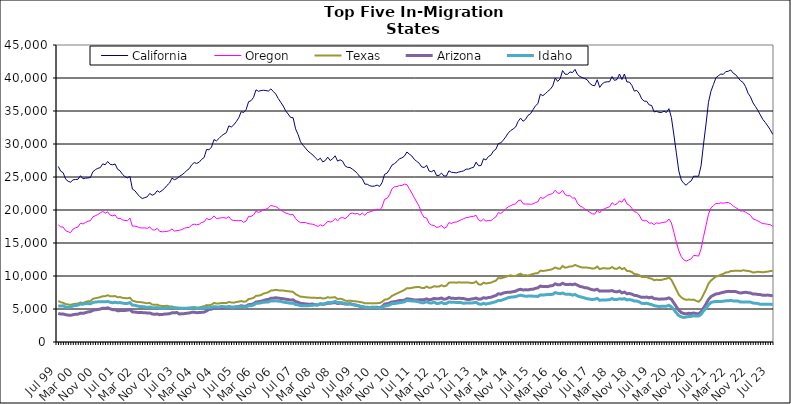
| Category |  California  |  Oregon  |  Texas  |  Arizona  |  Idaho  |
|---|---|---|---|---|---|
| Jul 99 | 26605 | 17749 | 6209 | 4339 | 5471 |
| Aug 99 | 25882 | 17447 | 6022 | 4228 | 5444 |
| Sep 99 | 25644 | 17401 | 5941 | 4237 | 5488 |
| Oct 99 | 24669 | 16875 | 5751 | 4134 | 5279 |
| Nov 99 | 24353 | 16701 | 5680 | 4073 | 5260 |
| Dec 99 | 24218 | 16570 | 5619 | 4042 | 5269 |
| Jan 00 | 24574 | 17109 | 5736 | 4142 | 5485 |
| Feb 00 | 24620 | 17295 | 5789 | 4192 | 5530 |
| Mar 00 | 24655 | 17436 | 5826 | 4226 | 5590 |
| Apr 00 | 25195 | 18009 | 5980 | 4375 | 5748 |
| May 00 | 24730 | 17875 | 5897 | 4337 | 5729 |
| Jun 00 | 24825 | 18113 | 6070 | 4444 | 5853 |
| Jul 00 | 24857 | 18294 | 6163 | 4555 | 5824 |
| Aug 00 | 24913 | 18376 | 6199 | 4603 | 5788 |
| Sep 00 | 25792 | 18971 | 6529 | 4804 | 5976 |
| Oct 00 | 26106 | 19135 | 6643 | 4870 | 6058 |
| Nov 00 | 26315 | 19306 | 6705 | 4926 | 6085 |
| Dec 00 | 26415 | 19570 | 6793 | 4991 | 6096 |
| Jan 01 | 26995 | 19781 | 6942 | 5122 | 6119 |
| Feb 01 | 26851 | 19519 | 6948 | 5089 | 6090 |
| Mar 01 | 27352 | 19720 | 7080 | 5180 | 6143 |
| Apr 01 | 26918 | 19221 | 6943 | 5020 | 6020 |
| May 01 | 26848 | 19126 | 6924 | 4899 | 5950 |
| Jun 01 | 26974 | 19241 | 6959 | 4895 | 6019 |
| Jul 01 | 26172 | 18725 | 6778 | 4737 | 5951 |
| Aug 01 | 25943 | 18736 | 6810 | 4757 | 5973 |
| Sep 01 | 25399 | 18514 | 6688 | 4753 | 5895 |
| Oct 01 | 25050 | 18415 | 6650 | 4780 | 5833 |
| Nov 01 | 24873 | 18381 | 6631 | 4826 | 5850 |
| Dec 01 | 25099 | 18765 | 6708 | 4898 | 5969 |
| Jan 02 | 23158 | 17561 | 6261 | 4560 | 5595 |
| Feb 02 | 22926 | 17573 | 6162 | 4531 | 5560 |
| Mar 02 | 22433 | 17452 | 6052 | 4481 | 5458 |
| Apr 02 | 22012 | 17314 | 6046 | 4458 | 5380 |
| May 02 | 21733 | 17267 | 6007 | 4452 | 5358 |
| Jun 02 | 21876 | 17298 | 5933 | 4444 | 5315 |
| Jul 02 | 21997 | 17209 | 5873 | 4383 | 5243 |
| Aug 02 | 22507 | 17436 | 5929 | 4407 | 5315 |
| Sep 02 | 22244 | 17010 | 5672 | 4248 | 5192 |
| Oct 02 | 22406 | 16952 | 5625 | 4191 | 5167 |
| Nov 02 | 22922 | 17223 | 5663 | 4242 | 5221 |
| Dec 02 | 22693 | 16770 | 5499 | 4142 | 5120 |
| Jan 03 | 22964 | 16694 | 5463 | 4166 | 5089 |
| Feb 03 | 23276 | 16727 | 5461 | 4226 | 5077 |
| Mar 03 | 23736 | 16766 | 5486 | 4251 | 5145 |
| Apr 03 | 24079 | 16859 | 5389 | 4289 | 5145 |
| May 03 | 24821 | 17117 | 5378 | 4415 | 5254 |
| Jun 03 | 24592 | 16812 | 5273 | 4426 | 5135 |
| Jul 03 | 24754 | 16875 | 5226 | 4466 | 5124 |
| Aug 03 | 25092 | 16922 | 5181 | 4244 | 5100 |
| Sep 03 | 25316 | 17036 | 5181 | 4279 | 5086 |
| Oct 03 | 25622 | 17228 | 5139 | 4301 | 5110 |
| Nov 03 | 25984 | 17335 | 5175 | 4362 | 5091 |
| Dec 03 | 26269 | 17350 | 5189 | 4396 | 5113 |
| Jan 04 | 26852 | 17734 | 5255 | 4492 | 5152 |
| Feb 04 | 27184 | 17860 | 5301 | 4502 | 5183 |
| Mar 04 | 27062 | 17757 | 5227 | 4443 | 5056 |
| Apr 04 | 27238 | 17840 | 5227 | 4461 | 5104 |
| May 04 | 27671 | 18113 | 5345 | 4493 | 5095 |
| Jun 04 | 27949 | 18201 | 5416 | 4532 | 5103 |
| Jul 04 | 29172 | 18727 | 5597 | 4697 | 5231 |
| Aug 04 | 29122 | 18529 | 5561 | 4945 | 5197 |
| Sep 04 | 29542 | 18678 | 5656 | 4976 | 5237 |
| Oct 04 | 30674 | 19108 | 5922 | 5188 | 5363 |
| Nov 04 | 30472 | 18716 | 5823 | 5106 | 5321 |
| Dec 04 | 30831 | 18755 | 5838 | 5135 | 5312 |
| Jan 05 | 31224 | 18823 | 5906 | 5155 | 5374 |
| Feb 05 | 31495 | 18842 | 5898 | 5168 | 5357 |
| Mar 05 | 31714 | 18738 | 5894 | 5212 | 5313 |
| Apr 05 | 32750 | 18998 | 6060 | 5340 | 5350 |
| May 05 | 32575 | 18504 | 5989 | 5269 | 5276 |
| Jun 05 | 32898 | 18414 | 5954 | 5252 | 5271 |
| Jul 05 | 33384 | 18395 | 6062 | 5322 | 5322 |
| Aug 05 | 33964 | 18381 | 6113 | 5375 | 5316 |
| Sep 05 | 34897 | 18426 | 6206 | 5493 | 5362 |
| Oct 05 | 34780 | 18132 | 6100 | 5408 | 5308 |
| Nov 05 | 35223 | 18332 | 6162 | 5434 | 5314 |
| Dec 05 | 36415 | 19047 | 6508 | 5658 | 5487 |
| Jan 06 | 36567 | 19032 | 6576 | 5688 | 5480 |
| Feb 06 | 37074 | 19257 | 6692 | 5792 | 5616 |
| Mar 06 | 38207 | 19845 | 6993 | 6052 | 5850 |
| Apr 06 | 37976 | 19637 | 7024 | 6101 | 5864 |
| May 06 | 38099 | 19781 | 7114 | 6178 | 5943 |
| Jun 06 | 38141 | 20061 | 7331 | 6276 | 6018 |
| Jul 06 | 38097 | 20111 | 7431 | 6399 | 6046 |
| Aug 06 | 38021 | 20333 | 7542 | 6450 | 6064 |
| Sep 06 | 38349 | 20686 | 7798 | 6627 | 6232 |
| Oct 06 | 37947 | 20591 | 7825 | 6647 | 6216 |
| Nov 06 | 37565 | 20526 | 7907 | 6707 | 6244 |
| Dec 06 | 36884 | 20272 | 7840 | 6648 | 6192 |
| Jan 07 | 36321 | 19984 | 7789 | 6597 | 6151 |
| Feb 07 | 35752 | 19752 | 7799 | 6554 | 6048 |
| Mar 07 | 35025 | 19547 | 7737 | 6487 | 5989 |
| Apr 07 | 34534 | 19412 | 7685 | 6430 | 5937 |
| May 07 | 34022 | 19296 | 7654 | 6353 | 5858 |
| Jun 07 | 33974 | 19318 | 7577 | 6390 | 5886 |
| Jul 07 | 32298 | 18677 | 7250 | 6117 | 5682 |
| Aug 07 | 31436 | 18322 | 7070 | 6034 | 5617 |
| Sep 07 | 30331 | 18087 | 6853 | 5847 | 5500 |
| Oct 07 | 29813 | 18108 | 6839 | 5821 | 5489 |
| Nov 07 | 29384 | 18105 | 6777 | 5769 | 5481 |
| Dec 07 | 28923 | 17949 | 6760 | 5733 | 5499 |
| Jan 08 | 28627 | 17890 | 6721 | 5732 | 5521 |
| Feb 08 | 28328 | 17834 | 6719 | 5749 | 5579 |
| Mar 08 | 27911 | 17680 | 6690 | 5650 | 5614 |
| Apr 08 | 27543 | 17512 | 6656 | 5612 | 5635 |
| May 08 | 27856 | 17754 | 6705 | 5774 | 5798 |
| Jun 08 | 27287 | 17589 | 6593 | 5717 | 5745 |
| Jul 08 | 27495 | 17834 | 6623 | 5761 | 5807 |
| Aug 08 | 28018 | 18309 | 6789 | 5867 | 5982 |
| Sep-08 | 27491 | 18164 | 6708 | 5864 | 5954 |
| Oct 08 | 27771 | 18291 | 6755 | 5942 | 6032 |
| Nov 08 | 28206 | 18706 | 6787 | 5970 | 6150 |
| Dec 08 | 27408 | 18353 | 6505 | 5832 | 5975 |
| Jan 09 | 27601 | 18778 | 6569 | 5890 | 5995 |
| Feb 09 | 27394 | 18863 | 6483 | 5845 | 5936 |
| Mar 09 | 26690 | 18694 | 6273 | 5751 | 5806 |
| Apr 09 | 26461 | 18943 | 6222 | 5735 | 5777 |
| May 09 | 26435 | 19470 | 6272 | 5819 | 5767 |
| Jun 09 | 26187 | 19522 | 6199 | 5700 | 5649 |
| Jul 09 | 25906 | 19408 | 6171 | 5603 | 5617 |
| Aug 09 | 25525 | 19469 | 6128 | 5533 | 5540 |
| Sep 09 | 25050 | 19249 | 6059 | 5405 | 5437 |
| Oct 09 | 24741 | 19529 | 6004 | 5349 | 5369 |
| Nov 09 | 23928 | 19187 | 5854 | 5271 | 5248 |
| Dec 09 | 23899 | 19607 | 5886 | 5261 | 5195 |
| Jan 10 | 23676 | 19703 | 5881 | 5232 | 5234 |
| Feb 10 | 23592 | 19845 | 5850 | 5272 | 5236 |
| Mar 10 | 23634 | 19946 | 5864 | 5278 | 5219 |
| Apr 10 | 23774 | 20134 | 5889 | 5257 | 5201 |
| May 10 | 23567 | 19966 | 5897 | 5172 | 5105 |
| Jun 10 | 24166 | 20464 | 6087 | 5356 | 5237 |
| Jul 10 | 25410 | 21627 | 6417 | 5742 | 5452 |
| Aug 10 | 25586 | 21744 | 6465 | 5797 | 5491 |
| Sep 10 | 26150 | 22314 | 6667 | 5907 | 5609 |
| Oct 10 | 26807 | 23219 | 6986 | 6070 | 5831 |
| Nov 10 | 27033 | 23520 | 7179 | 6100 | 5810 |
| Dec 10 | 27332 | 23551 | 7361 | 6182 | 5898 |
| Jan 11 | 27769 | 23697 | 7525 | 6276 | 5938 |
| Feb 11 | 27898 | 23718 | 7708 | 6267 | 6016 |
| Mar 11 | 28155 | 23921 | 7890 | 6330 | 6081 |
| Apr 11 | 28790 | 23847 | 8146 | 6544 | 6305 |
| May 11 | 28471 | 23215 | 8131 | 6502 | 6248 |
| Jun 11 | 28191 | 22580 | 8199 | 6445 | 6217 |
| Jul 11 | 27678 | 21867 | 8291 | 6368 | 6202 |
| Aug 11 | 27372 | 21203 | 8321 | 6356 | 6146 |
| Sep 11 | 27082 | 20570 | 8341 | 6387 | 6075 |
| Oct 11 | 26528 | 19442 | 8191 | 6402 | 5932 |
| Nov 11 | 26440 | 18872 | 8176 | 6426 | 5968 |
| Dec 11 | 26770 | 18784 | 8401 | 6533 | 6106 |
| Jan 12 | 25901 | 17963 | 8202 | 6390 | 5933 |
| Feb 12 | 25796 | 17718 | 8266 | 6456 | 5900 |
| Mar 12 | 26042 | 17647 | 8456 | 6600 | 6054 |
| Apr 12 | 25239 | 17386 | 8388 | 6534 | 5838 |
| May 12 | 25238 | 17407 | 8401 | 6558 | 5854 |
| Jun 12 | 25593 | 17673 | 8594 | 6669 | 6009 |
| Jul 12 | 25155 | 17237 | 8432 | 6474 | 5817 |
| Aug 12 | 25146 | 17391 | 8536 | 6539 | 5842 |
| Sep 12 | 25942 | 18102 | 8989 | 6759 | 6061 |
| Oct 12 | 25718 | 17953 | 9012 | 6618 | 6027 |
| Nov 12 | 25677 | 18134 | 9032 | 6611 | 6009 |
| Dec 12 | 25619 | 18166 | 8981 | 6601 | 5999 |
| Jan 13 | 25757 | 18344 | 9051 | 6627 | 5989 |
| Feb-13 | 25830 | 18512 | 9001 | 6606 | 5968 |
| Mar-13 | 25940 | 18689 | 9021 | 6577 | 5853 |
| Apr 13 | 26187 | 18844 | 9013 | 6478 | 5925 |
| May 13 | 26192 | 18884 | 9003 | 6431 | 5924 |
| Jun-13 | 26362 | 19013 | 8948 | 6508 | 5896 |
| Jul 13 | 26467 | 19037 | 8958 | 6559 | 5948 |
| Aug 13 | 27253 | 19198 | 9174 | 6655 | 6020 |
| Sep 13 | 26711 | 18501 | 8747 | 6489 | 5775 |
| Oct 13 | 26733 | 18301 | 8681 | 6511 | 5711 |
| Nov 13 | 27767 | 18620 | 8989 | 6709 | 5860 |
| Dec 13 | 27583 | 18320 | 8863 | 6637 | 5740 |
| Jan 14 | 28107 | 18409 | 8939 | 6735 | 5843 |
| Feb-14 | 28313 | 18383 | 8989 | 6779 | 5893 |
| Mar 14 | 28934 | 18696 | 9160 | 6918 | 6015 |
| Apr 14 | 29192 | 18946 | 9291 | 7036 | 6099 |
| May 14 | 30069 | 19603 | 9701 | 7314 | 6304 |
| Jun 14 | 30163 | 19487 | 9641 | 7252 | 6293 |
| Jul-14 | 30587 | 19754 | 9752 | 7415 | 6427 |
| Aug-14 | 31074 | 20201 | 9882 | 7499 | 6557 |
| Sep 14 | 31656 | 20459 | 9997 | 7536 | 6719 |
| Oct 14 | 32037 | 20663 | 10109 | 7555 | 6786 |
| Nov 14 | 32278 | 20825 | 9992 | 7628 | 6831 |
| Dec 14 | 32578 | 20918 | 10006 | 7705 | 6860 |
| Jan 15 | 33414 | 21396 | 10213 | 7906 | 7000 |
| Feb 15 | 33922 | 21518 | 10337 | 7982 | 7083 |
| Mar 15 | 33447 | 20942 | 10122 | 7891 | 7006 |
| Apr-15 | 33731 | 20893 | 10138 | 7906 | 6931 |
| May 15 | 34343 | 20902 | 10053 | 7895 | 6952 |
| Jun-15 | 34572 | 20870 | 10192 | 7973 | 6966 |
| Jul 15 | 35185 | 20916 | 10303 | 8000 | 6949 |
| Aug 15 | 35780 | 21115 | 10399 | 8126 | 6938 |
| Sep 15 | 36109 | 21246 | 10428 | 8207 | 6896 |
| Oct 15 | 37555 | 21908 | 10813 | 8477 | 7140 |
| Nov 15 | 37319 | 21750 | 10763 | 8390 | 7112 |
| Dec 15 | 37624 | 21990 | 10807 | 8395 | 7149 |
| Jan 16 | 37978 | 22248 | 10892 | 8388 | 7201 |
| Feb 16 | 38285 | 22369 | 10951 | 8508 | 7192 |
| Mar 16 | 38792 | 22506 | 11075 | 8547 | 7226 |
| Apr 16 | 39994 | 22999 | 11286 | 8815 | 7487 |
| May 16 | 39488 | 22548 | 11132 | 8673 | 7382 |
| Jun 16 | 39864 | 22556 | 11100 | 8682 | 7315 |
| Jul 16 | 41123 | 22989 | 11516 | 8903 | 7420 |
| Aug 16 | 40573 | 22333 | 11251 | 8731 | 7261 |
| Sep 16 | 40560 | 22162 | 11340 | 8692 | 7216 |
| Oct 16 | 40923 | 22172 | 11456 | 8742 | 7233 |
| Nov 16 | 40817 | 21818 | 11459 | 8685 | 7101 |
| Dec 16 | 41311 | 21815 | 11681 | 8783 | 7203 |
| Jan 17 | 40543 | 21029 | 11524 | 8609 | 6982 |
| Feb 17 | 40218 | 20613 | 11385 | 8416 | 6852 |
| Mar 17 | 40052 | 20425 | 11276 | 8354 | 6775 |
| Apr 17 | 39913 | 20147 | 11297 | 8218 | 6653 |
| May 17 | 39695 | 19910 | 11265 | 8196 | 6552 |
| Jun 17 | 39177 | 19650 | 11225 | 8034 | 6500 |
| Jul 17 | 38901 | 19419 | 11115 | 7923 | 6429 |
| Aug 17 | 38827 | 19389 | 11168 | 7867 | 6479 |
| Sep 17 | 39736 | 19936 | 11426 | 7991 | 6609 |
| Oct 17 | 38576 | 19547 | 11041 | 7708 | 6315 |
| Nov 17 | 39108 | 20013 | 11158 | 7746 | 6381 |
| Dec 17 | 39359 | 20202 | 11185 | 7743 | 6366 |
| Jan 18 | 39420 | 20362 | 11118 | 7736 | 6380 |
| Feb 18 | 39440 | 20476 | 11128 | 7741 | 6407 |
| Mar 18 | 40218 | 21106 | 11362 | 7789 | 6578 |
| Apr 18 | 39637 | 20788 | 11111 | 7642 | 6423 |
| May 18 | 39777 | 20933 | 11097 | 7591 | 6430 |
| Jun 18 | 40602 | 21381 | 11317 | 7721 | 6554 |
| Jul 18 | 39767 | 21189 | 11038 | 7445 | 6489 |
| Aug 18 | 40608 | 21729 | 11200 | 7560 | 6569 |
| Sep 18 | 39395 | 20916 | 10772 | 7318 | 6383 |
| Oct 18 | 39383 | 20724 | 10740 | 7344 | 6429 |
| Nov 18 | 38891 | 20265 | 10605 | 7255 | 6365 |
| Dec 18 | 38013 | 19741 | 10292 | 7069 | 6205 |
| Jan 19 | 38130 | 19643 | 10261 | 7032 | 6203 |
| Feb 19 | 37658 | 19237 | 10132 | 6892 | 6073 |
| Mar 19 | 36831 | 18492 | 9848 | 6766 | 5863 |
| Apr 19 | 36492 | 18349 | 9839 | 6763 | 5827 |
| May 19 | 36481 | 18407 | 9867 | 6809 | 5873 |
| Jun 19 | 35925 | 17998 | 9661 | 6698 | 5761 |
| Jul 19 | 35843 | 18049 | 9598 | 6800 | 5673 |
| Aug 19 | 34870 | 17785 | 9361 | 6577 | 5512 |
| Sep 19 | 34945 | 18038 | 9428 | 6547 | 5437 |
| Oct 19 | 34802 | 17977 | 9385 | 6483 | 5390 |
| Nov 19 | 34775 | 18072 | 9403 | 6511 | 5401 |
| Dec 19 | 34976 | 18140 | 9518 | 6521 | 5419 |
| Jan 20 | 34774 | 18209 | 9594 | 6561 | 5434 |
| Feb 20 | 35352 | 18632 | 9804 | 6682 | 5543 |
| Mar 20 | 34013 | 18041 | 9411 | 6464 | 5330 |
| Apr 20 | 31385 | 16629 | 8666 | 5922 | 4906 |
| May 20 | 28657 | 15123 | 7927 | 5355 | 4419 |
| Jun 20 | 25915 | 13817 | 7164 | 4815 | 3992 |
| Jul 20 | 24545 | 12926 | 6776 | 4457 | 3810 |
| Aug 20 | 24048 | 12443 | 6521 | 4326 | 3720 |
| Sep 20 | 23756 | 12258 | 6386 | 4266 | 3784 |
| Oct 20 | 24166 | 12429 | 6452 | 4347 | 3861 |
| Nov 20 | 24404 | 12597 | 6386 | 4324 | 3883 |
| Dec 20 | 25120 | 13122 | 6420 | 4394 | 3974 |
| Jan 21 | 25111 | 13080 | 6236 | 4304 | 3924 |
| Feb 21 | 25114 | 13015 | 6094 | 4260 | 3930 |
| Mar 21 | 26701 | 14096 | 6455 | 4567 | 4185 |
| Apr 21 | 29998 | 15978 | 7222 | 5164 | 4697 |
| May 21 | 33020 | 17641 | 7969 | 5748 | 5148 |
| Jun 21 | 36320 | 19369 | 8840 | 6450 | 5628 |
| Jul 21 | 37989 | 20320 | 9306 | 6877 | 5984 |
| Aug 21 | 39007 | 20657 | 9615 | 7094 | 6084 |
| Sep 21 | 40023 | 20974 | 9914 | 7277 | 6151 |
| Oct 21 | 40348 | 20966 | 10003 | 7327 | 6140 |
| Nov 21 | 40599 | 21096 | 10203 | 7437 | 6136 |
| Dec 21 | 40548 | 21032 | 10328 | 7532 | 6183 |
| Jan 22 | 40967 | 21106 | 10535 | 7618 | 6237 |
| Feb 22 | 41019 | 21125 | 10579 | 7673 | 6236 |
| Mar 22 | 41220 | 20949 | 10751 | 7660 | 6310 |
| Apr 22 | 40730 | 20602 | 10772 | 7661 | 6221 |
| May 22 | 40504 | 20370 | 10792 | 7636 | 6210 |
| Jun 22 | 40013 | 20127 | 10802 | 7504 | 6199 |
| Jul 22 | 39582 | 19846 | 10761 | 7419 | 6050 |
| Aug 22 | 39321 | 19865 | 10868 | 7487 | 6071 |
| Sep 22 | 38685 | 19666 | 10811 | 7536 | 6074 |
| Oct 22 | 37700 | 19450 | 10764 | 7469 | 6042 |
| Nov 22 | 37133 | 19198 | 10701 | 7425 | 6042 |
| Dec 22 | 36232 | 18659 | 10527 | 7261 | 5898 |
| Jan 23 | 35674 | 18528 | 10578 | 7263 | 5879 |
| Feb 23 | 35072 | 18344 | 10642 | 7211 | 5827 |
| Mar 23 | 34396 | 18133 | 10609 | 7183 | 5713 |
| Apr 23 | 33708 | 17931 | 10559 | 7074 | 5706 |
| May 23 | 33245 | 17904 | 10624 | 7091 | 5712 |
| Jun 23 | 32727 | 17831 | 10663 | 7105 | 5726 |
| Jul 23 | 32148 | 17773 | 10760 | 7058 | 5719 |
| Aug 23 | 31461 | 17513 | 10759 | 6999 | 5681 |